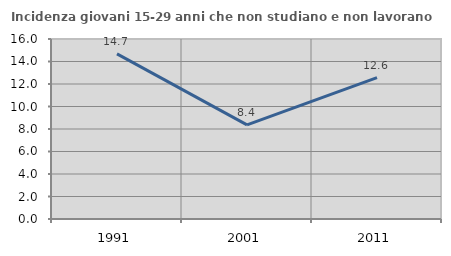
| Category | Incidenza giovani 15-29 anni che non studiano e non lavorano  |
|---|---|
| 1991.0 | 14.681 |
| 2001.0 | 8.361 |
| 2011.0 | 12.569 |